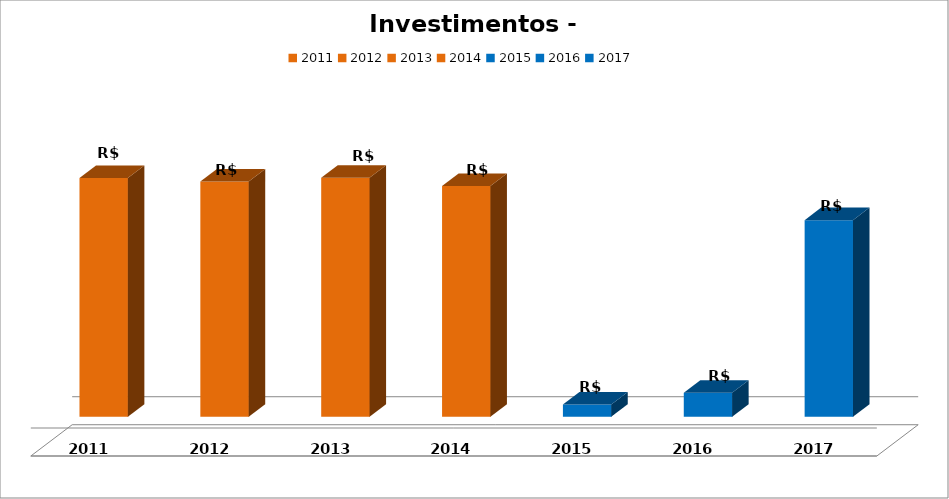
| Category | Series 1 |
|---|---|
| 2011.0 | 41677558.69 |
| 2012.0 | 41036668.67 |
| 2013.0 | 41692709.8 |
| 2014.0 | 40262738.3 |
| 2015.0 | 2120620.71 |
| 2016.0 | 4193958 |
| 2017.0 | 34308316 |